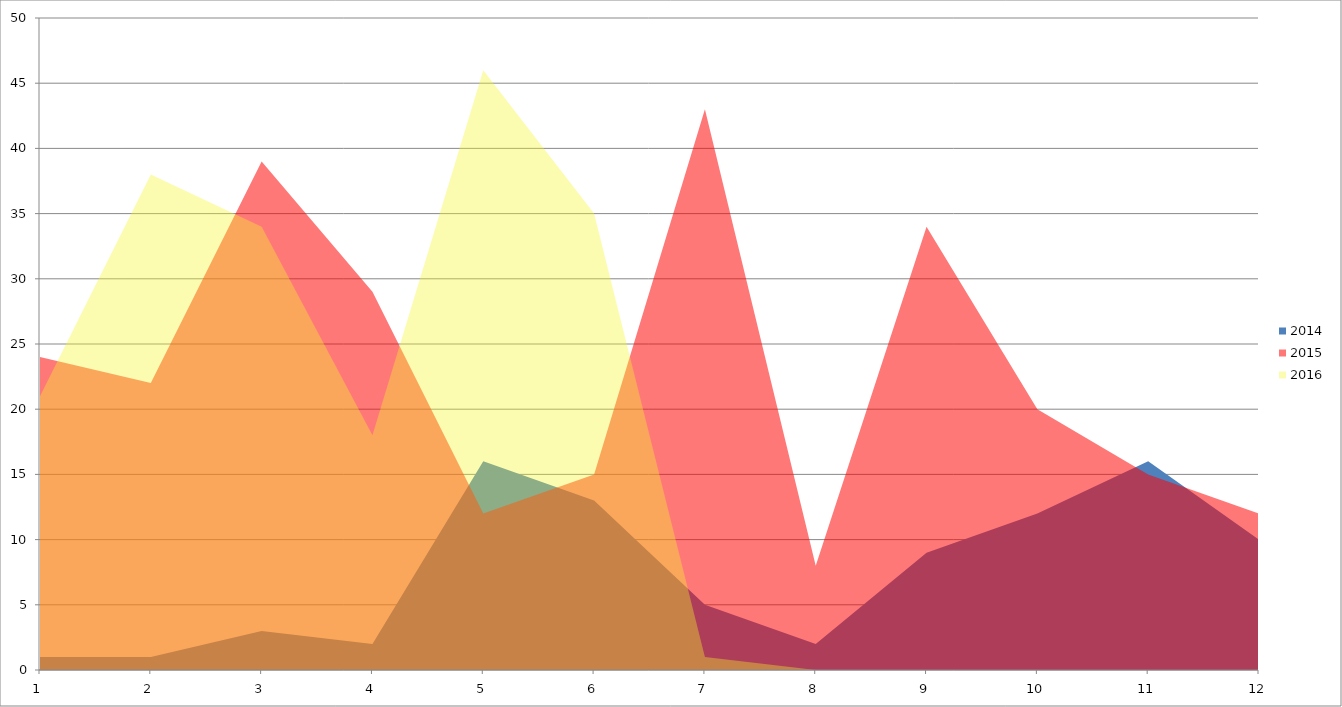
| Category | 2014 | 2015 | 2016 |
|---|---|---|---|
| 0 | 1 | 24 | 21 |
| 1 | 1 | 22 | 38 |
| 2 | 3 | 39 | 34 |
| 3 | 2 | 29 | 18 |
| 4 | 16 | 12 | 46 |
| 5 | 13 | 15 | 35 |
| 6 | 5 | 43 | 1 |
| 7 | 2 | 8 | 0 |
| 8 | 9 | 34 | 0 |
| 9 | 12 | 20 | 0 |
| 10 | 16 | 15 | 0 |
| 11 | 10 | 12 | 0 |